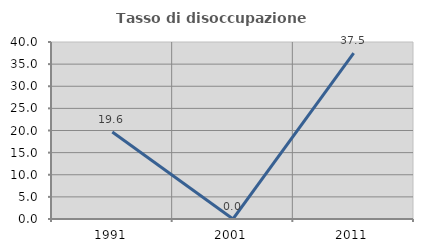
| Category | Tasso di disoccupazione giovanile  |
|---|---|
| 1991.0 | 19.643 |
| 2001.0 | 0 |
| 2011.0 | 37.5 |